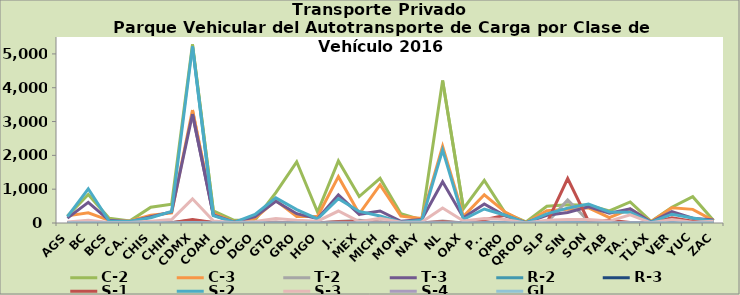
| Category | C-2 | C-3 | T-2 | T-3 | R-2 | R-3 | S-1 | S-2 | S-3 | S-4 | GI |
|---|---|---|---|---|---|---|---|---|---|---|---|
| AGS | 209 | 211 | 5 | 144 | 4 | 0 | 9 | 188 | 30 | 1 | 0 |
| BC | 843 | 301 | 58 | 610 | 19 | 3 | 25 | 1012 | 79 | 3 | 0 |
| BCS | 139 | 78 | 1 | 80 | 1 | 6 | 0 | 57 | 16 | 0 | 0 |
| CAMP | 63 | 59 | 10 | 35 | 0 | 0 | 0 | 55 | 15 | 0 | 0 |
| CHIS | 464 | 230 | 4 | 183 | 5 | 0 | 11 | 154 | 51 | 0 | 0 |
| CHIH | 558 | 298 | 14 | 329 | 1 | 1 | 10 | 345 | 104 | 1 | 0 |
| CDMX | 5283 | 3343 | 79 | 3220 | 79 | 13 | 101 | 5221 | 715 | 6 | 8 |
| COAH | 357 | 281 | 14 | 236 | 2 | 1 | 15 | 219 | 62 | 0 | 0 |
| COL | 80 | 36 | 5 | 21 | 2 | 1 | 7 | 21 | 6 | 0 | 0 |
| DGO | 88 | 139 | 22 | 191 | 1 | 0 | 3 | 253 | 44 | 1 | 0 |
| GTO | 898 | 666 | 19 | 644 | 2 | 0 | 21 | 742 | 132 | 1 | 3 |
| GRO | 1810 | 189 | 0 | 275 | 3 | 1 | 0 | 397 | 81 | 0 | 1 |
| HGO | 325 | 194 | 2 | 128 | 0 | 0 | 4 | 119 | 55 | 0 | 0 |
| JAL | 1837 | 1370 | 46 | 833 | 5 | 12 | 38 | 718 | 354 | 2 | 1 |
| MEX | 783 | 272 | 82 | 256 | 10 | 3 | 42 | 342 | 39 | 0 | 2 |
| MICH | 1319 | 1124 | 26 | 356 | 9 | 4 | 25 | 206 | 139 | 0 | 0 |
| MOR | 273 | 202 | 4 | 49 | 3 | 1 | 0 | 23 | 22 | 0 | 0 |
| NAY | 94 | 133 | 0 | 103 | 0 | 0 | 4 | 80 | 28 | 0 | 0 |
| NL | 4211 | 2264 | 61 | 1221 | 18 | 11 | 38 | 2161 | 446 | 0 | 1 |
| OAX | 424 | 195 | 0 | 156 | 1 | 4 | 0 | 105 | 59 | 0 | 0 |
| PUE | 1260 | 835 | 26 | 564 | 9 | 4 | 95 | 414 | 132 | 0 | 0 |
| QRO | 303 | 322 | 8 | 210 | 2 | 0 | 227 | 231 | 106 | 0 | 2 |
| QROO | 34 | 6 | 1 | 8 | 1 | 0 | 0 | 4 | 2 | 0 | 0 |
| SLP | 495 | 365 | 7 | 230 | 6 | 2 | 4 | 272 | 80 | 0 | 1 |
| SIN | 537 | 409 | 684 | 309 | 1 | 0 | 1315 | 440 | 103 | 0 | 2 |
| SON | 527 | 449 | 59 | 481 | 6 | 0 | 55 | 562 | 104 | 1 | 0 |
| TAB | 357 | 157 | 5 | 291 | 1 | 5 | 81 | 327 | 57 | 0 | 0 |
| TAMS | 622 | 413 | 8 | 417 | 5 | 1 | 16 | 319 | 239 | 6 | 0 |
| TLAX | 48 | 40 | 0 | 29 | 5 | 0 | 0 | 22 | 6 | 0 | 0 |
| VER | 466 | 450 | 34 | 337 | 2 | 0 | 158 | 260 | 103 | 0 | 0 |
| YUC | 778 | 403 | 28 | 142 | 1 | 0 | 56 | 149 | 23 | 1 | 2 |
| ZAC | 77 | 71 | 2 | 91 | 0 | 1 | 1 | 49 | 52 | 0 | 0 |